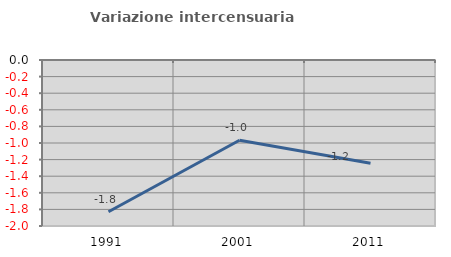
| Category | Variazione intercensuaria annua |
|---|---|
| 1991.0 | -1.828 |
| 2001.0 | -0.967 |
| 2011.0 | -1.244 |